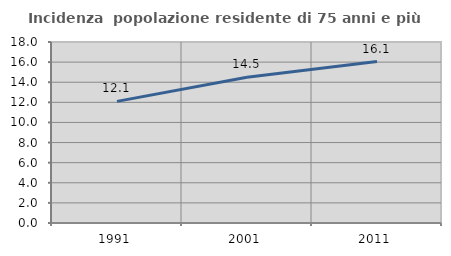
| Category | Incidenza  popolazione residente di 75 anni e più |
|---|---|
| 1991.0 | 12.097 |
| 2001.0 | 14.488 |
| 2011.0 | 16.053 |